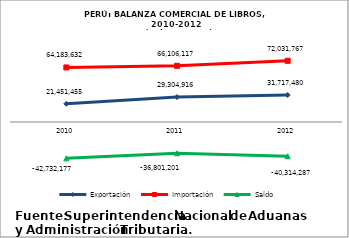
| Category | Exportación | Importación | Saldo |
|---|---|---|---|
| 2010.0 | 21451454.71 | 64183631.829 | -42732177.119 |
| 2011.0 | 29304915.86 | 66106116.678 | -36801200.818 |
| 2012.0 | 31717480.1 | 72031766.88 | -40314286.78 |